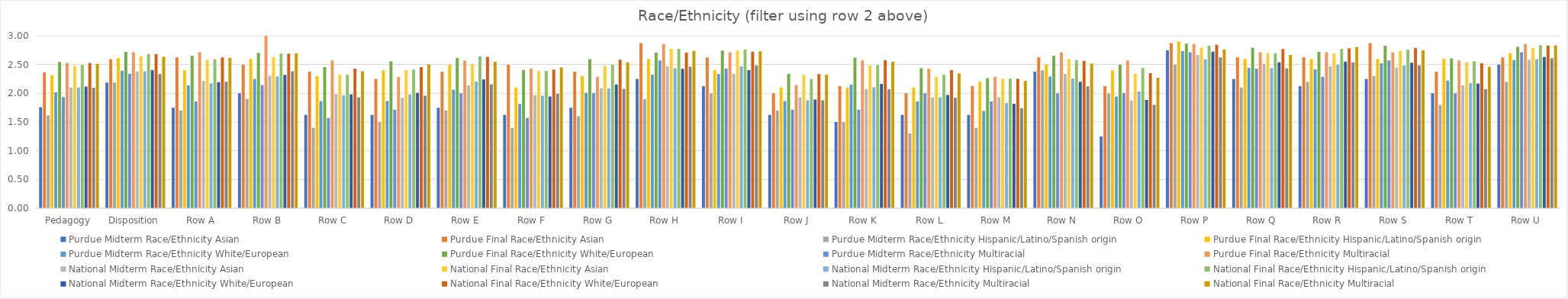
| Category | Purdue | National |
|---|---|---|
| Pedagogy | 2.527 | 2.511 |
| Disposition | 2.714 | 2.634 |
| Row A | 2.714 | 2.617 |
| Row B | 3 | 2.696 |
| Row C | 2.571 | 2.383 |
| Row D | 2.286 | 2.504 |
| Row E | 2.571 | 2.548 |
| Row F | 2.429 | 2.452 |
| Row G | 2.286 | 2.539 |
| Row H | 2.857 | 2.739 |
| Row I | 2.714 | 2.73 |
| Row J | 2.143 | 2.325 |
| Row K | 2.571 | 2.548 |
| Row L | 2.429 | 2.348 |
| Row M | 2.286 | 2.217 |
| Row N | 2.714 | 2.518 |
| Row O | 2.571 | 2.27 |
| Row P | 2.857 | 2.765 |
| Row Q | 2.714 | 2.67 |
| Row R | 2.714 | 2.809 |
| Row S | 2.714 | 2.748 |
| Row T | 2.571 | 2.461 |
| Row U | 2.857 | 2.835 |